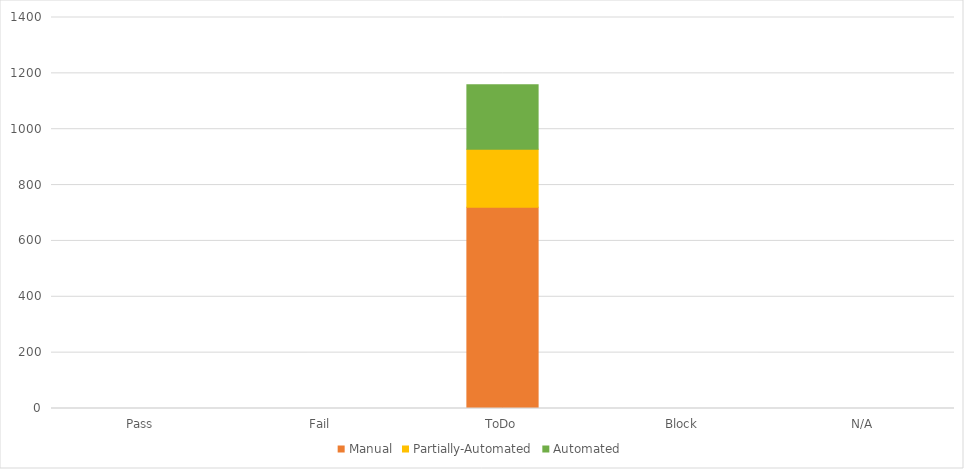
| Category | Manual | Partially-Automated | Automated |
|---|---|---|---|
| Pass | 0 | 0 | 0 |
| Fail | 0 | 0 | 0 |
| ToDo | 721 | 207 | 231 |
| Block | 0 | 0 | 0 |
| N/A | 0 | 0 | 0 |